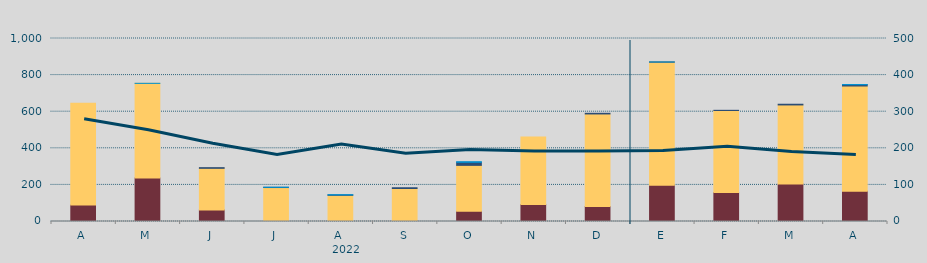
| Category | Carbón | Ciclo Combinado | Cogeneración | Consumo Bombeo | Eólica | Hidráulica | Otras Renovables | Solar fotovoltaica | Solar térmica | Turbinación bombeo | Nuclear |
|---|---|---|---|---|---|---|---|---|---|---|---|
| A | 89745.4 | 556069.1 | 0 | 0 | 0 | 0 | 0 | 0 | 0 | 0 | 0 |
| M | 238246.1 | 516625.8 | 0 | 0 | 0 | 170 | 0 | 0 | 0 | 0 | 0 |
| J | 63431.6 | 227120.9 | 0 | 3696.9 | 0 | 0 | 0 | 0 | 0 | 0 | 0 |
| J | 347.9 | 185242.2 | 0 | 1000 | 0 | 958 | 0 | 0 | 0 | 0 | 0 |
| A | 0 | 142890.1 | 241.5 | 1836 | 0 | 1759 | 0 | 0 | 0 | 0 | 0 |
| S | 2508 | 177724.1 | 0 | 4233 | 0 | 0 | 52.5 | 0 | 0 | 0 | 0 |
| O | 55771 | 250950.8 | 0 | 16354.2 | 0 | 3609 | 27 | 0 | 0 | 0 | 0 |
| N | 92910 | 369242.3 | 0 | 0 | 0 | 0 | 0 | 0 | 0 | 0 | 0 |
| D | 82210 | 505508.6 | 0 | 3568.7 | 0 | 0 | 0 | 0 | 0 | 0 | 0 |
| E | 198667 | 672278.9 | 0 | 600 | 0 | 167.2 | 0 | 0 | 0 | 0 | 0 |
| F | 158446.8 | 448230.6 | 0 | 876 | 0 | 0 | 0 | 0 | 0 | 0 | 0 |
| M | 205470 | 431456.4 | 0 | 3844 | 0 | 0 | 0 | 0 | 0 | 0 | 0 |
| A | 165579 | 574881.6 | 0 | 7190 | 0 | 954 | 0 | 0 | 0 | 0 | 0 |